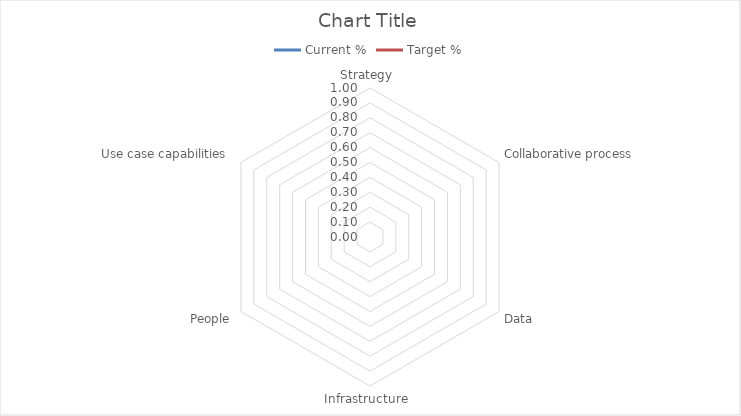
| Category | Current % | Target % |
|---|---|---|
| Strategy  | 0 | 0 |
| Collaborative process | 0 | 0 |
| Data | 0 | 0 |
| Infrastructure  | 0 | 0 |
| People | 0 | 0 |
| Use case capabilities  | 0 | 0 |